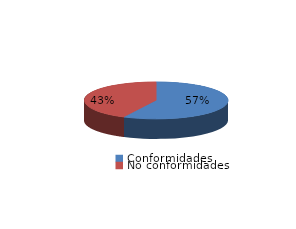
| Category | Series 0 |
|---|---|
| Conformidades | 325 |
| No conformidades | 242 |